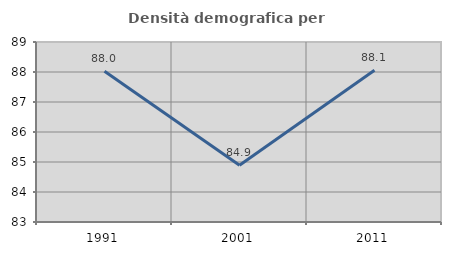
| Category | Densità demografica |
|---|---|
| 1991.0 | 88.027 |
| 2001.0 | 84.892 |
| 2011.0 | 88.058 |